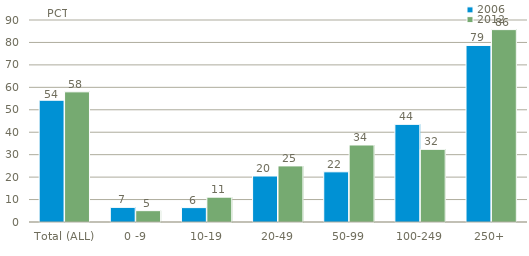
| Category | 2006 | 2012 |
|---|---|---|
| Total (ALL) | 54.252 | 57.996 |
| 0 -9 | 6.517 | 5.05 |
| 10-19 | 6.405 | 11.057 |
| 20-49 | 20.49 | 24.999 |
| 50-99 | 22.357 | 34.311 |
| 100-249 | 43.503 | 32.374 |
| 250+ | 78.662 | 85.713 |